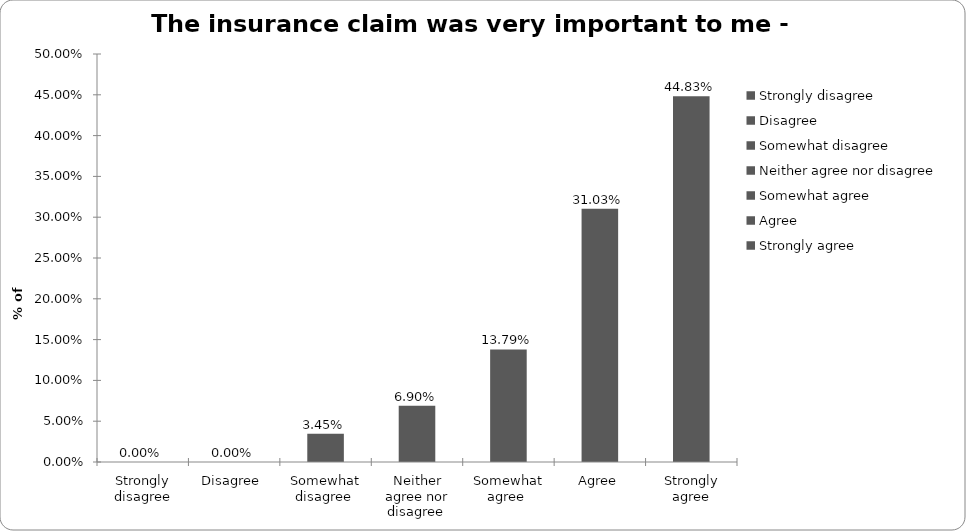
| Category | Series 0 |
|---|---|
| Strongly disagree | 0 |
| Disagree  | 0 |
| Somewhat disagree  | 0.034 |
| Neither agree nor disagree  | 0.069 |
| Somewhat agree  | 0.138 |
| Agree | 0.31 |
| Strongly agree | 0.448 |